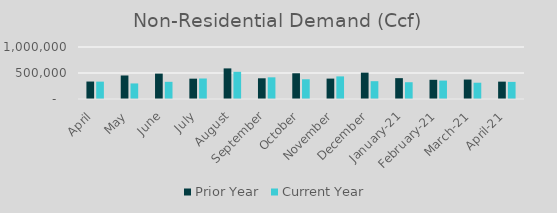
| Category | Prior Year | Current Year |
|---|---|---|
| April | 335781.44 | 333800.488 |
| May | 452130.67 | 299245.56 |
| June | 488107.52 | 330441.187 |
| July | 390975.65 | 394304.316 |
| August | 588468.22 | 522963.473 |
| September | 398263 | 416886.629 |
| October | 494775 | 379515 |
| November | 392357 | 434815 |
| December | 507022 | 342584.594 |
| January-21 | 400923.849 | 322657.16 |
| February-21 | 369131.684 | 354041 |
| March-21 | 374117 | 313343 |
| April-21 | 333800.488 | 329084.722 |